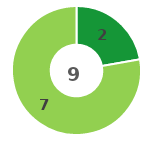
| Category | Series 0 |
|---|---|
| 0 | 2 |
| 1 | 7 |
| 2 | 0 |
| 3 | 0 |
| 4 | 0 |